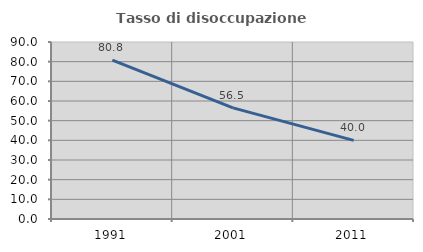
| Category | Tasso di disoccupazione giovanile  |
|---|---|
| 1991.0 | 80.769 |
| 2001.0 | 56.522 |
| 2011.0 | 40 |